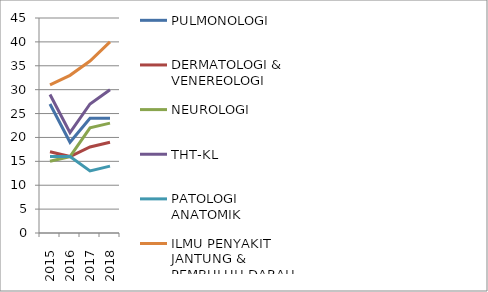
| Category | PULMONOLOGI | DERMATOLOGI & VENEREOLOGI | NEUROLOGI | THT-KL | PATOLOGI ANATOMIK | ILMU PENYAKIT JANTUNG & PEMBULUH DARAH |
|---|---|---|---|---|---|---|
| 2015 | 27 | 17 | 15 | 29 | 16 | 31 |
| 2016 | 19 | 16 | 16 | 21 | 16 | 33 |
| 2017 | 24 | 18 | 22 | 27 | 13 | 36 |
| 2018 | 24 | 19 | 23 | 30 | 14 | 40 |